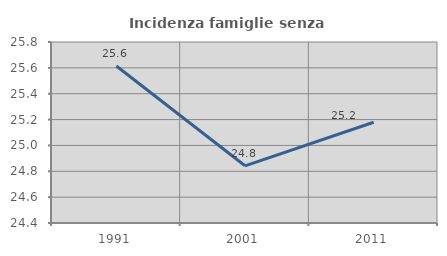
| Category | Incidenza famiglie senza nuclei |
|---|---|
| 1991.0 | 25.614 |
| 2001.0 | 24.842 |
| 2011.0 | 25.179 |